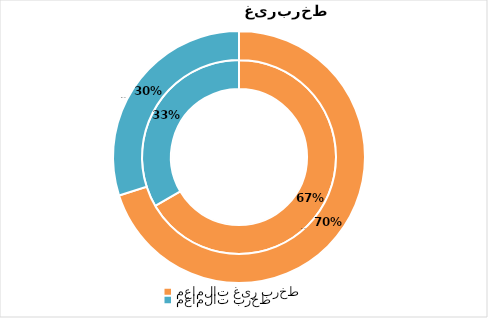
| Category | مهر 96 | آبان 96 |
|---|---|---|
| معاملات غیر برخط | 13804378758 | 17467405841.5 |
| معاملات برخط | 6924577344 | 7467908743.5 |